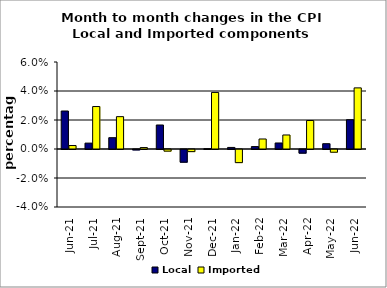
| Category | Local | Imported |
|---|---|---|
| 2021-06-01 | 0.026 | 0.002 |
| 2021-07-01 | 0.004 | 0.029 |
| 2021-08-01 | 0.008 | 0.022 |
| 2021-09-01 | 0 | 0.001 |
| 2021-10-01 | 0.017 | -0.001 |
| 2021-11-01 | -0.009 | -0.001 |
| 2021-12-01 | 0 | 0.039 |
| 2022-01-01 | 0.001 | -0.009 |
| 2022-02-01 | 0.002 | 0.007 |
| 2022-03-01 | 0.004 | 0.01 |
| 2022-04-01 | -0.003 | 0.02 |
| 2022-05-01 | 0.004 | -0.002 |
| 2022-06-01 | 0.02 | 0.042 |